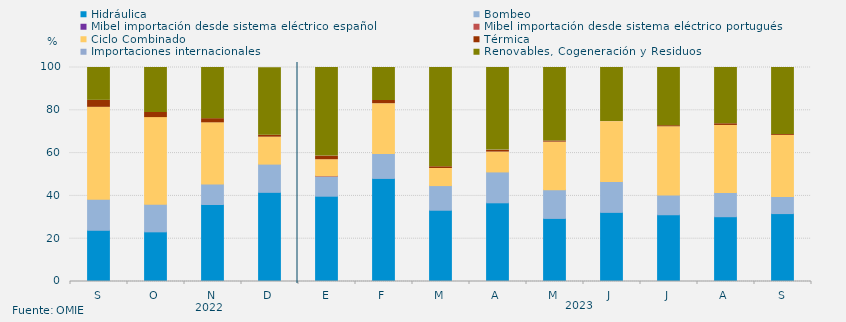
| Category | Hidráulica | Bombeo | Mibel importación desde sistema eléctrico español | Mibel importación desde sistema eléctrico portugués | Ciclo Combinado | Térmica | Importaciones internacionales | Renovables, Cogeneración y Residuos |
|---|---|---|---|---|---|---|---|---|
| S | 23.935 | 14.514 | 0 | 0 | 42.94 | 3.264 | 0 | 15.347 |
| O | 23.208 | 12.926 | 0 | 0 | 40.457 | 2.419 | 0 | 20.99 |
| N | 35.972 | 9.537 | 0 | 0 | 28.634 | 1.944 | 0 | 23.912 |
| D | 41.662 | 13.19 | 0 | 0 | 12.59 | 0.914 | 0 | 31.537 |
| E | 39.852 | 9.42 | 0 | 0.134 | 7.493 | 1.703 | 0 | 41.398 |
| F | 48.165 | 11.657 | 0 | 0 | 23.264 | 1.488 | 0 | 15.427 |
| M | 33.3 | 11.519 | 0 | 0 | 7.974 | 0.83 | 0 | 46.377 |
| A | 36.771 | 14.433 | 0 | 0 | 9.271 | 0.88 | 0.069 | 38.576 |
| M | 29.48 | 13.418 | 0 | 0 | 22.222 | 0.538 | 0 | 34.341 |
| J | 32.303 | 14.468 | 0 | 0 | 27.905 | 0.035 | 0 | 25.289 |
| J | 31.194 | 9.218 | 0 | 0 | 31.888 | 0.515 | 0 | 27.184 |
| A | 30.276 | 11.279 | 0 | 0 | 31.362 | 0.795 | 0 | 26.288 |
| S | 31.736 | 7.94 | 0 | 0 | 28.611 | 0.463 | 0 | 31.25 |